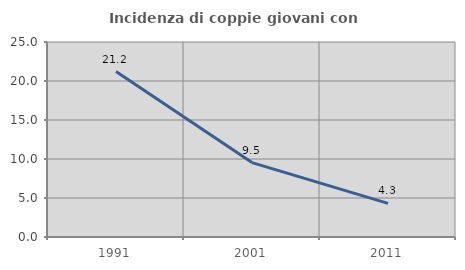
| Category | Incidenza di coppie giovani con figli |
|---|---|
| 1991.0 | 21.203 |
| 2001.0 | 9.539 |
| 2011.0 | 4.31 |